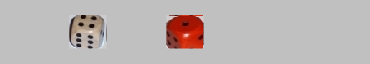
| Category | 1 | 2 | 3 | 4 | 5 | 6 |
|---|---|---|---|---|---|---|
|  | 0 | 0 | 0 | 0 | 0 | 0 |
| 4 | 0 | 0 | 0 | 1 | 0 | 0 |
|  | 0 | 0 | 0 | 0 | 0 | 0 |
| 1 | 1 | 0 | 0 | 0 | 0 | 0 |